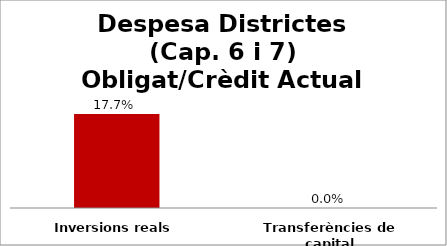
| Category | Series 0 |
|---|---|
| Inversions reals | 0.177 |
| Transferències de capital | 0 |